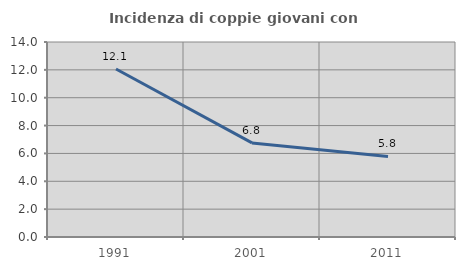
| Category | Incidenza di coppie giovani con figli |
|---|---|
| 1991.0 | 12.059 |
| 2001.0 | 6.755 |
| 2011.0 | 5.786 |